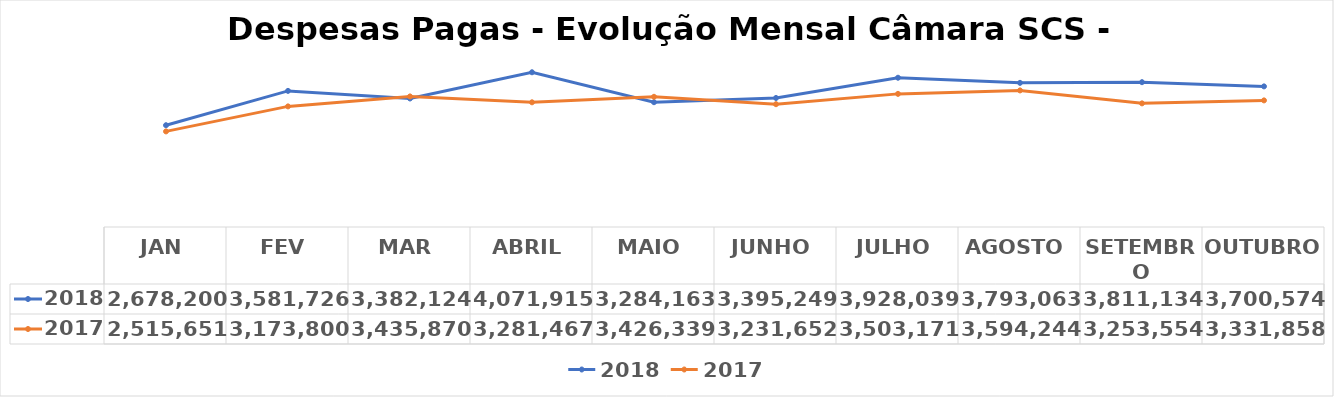
| Category | 2018 | 2017 |
|---|---|---|
| JAN | 2678200.13 | 2515651.19 |
| FEV | 3581726.08 | 3173799.81 |
| MAR | 3382123.82 | 3435869.68 |
| ABRIL | 4071915.46 | 3281467.14 |
| MAIO | 3284163.35 | 3426339.43 |
| JUNHO | 3395249.13 | 3231652.19 |
| JULHO | 3928039.19 | 3503171.49 |
| AGOSTO | 3793062.58 | 3594244.27 |
| SETEMBRO | 3811133.53 | 3253554.19 |
| OUTUBRO | 3700573.79 | 3331858.04 |